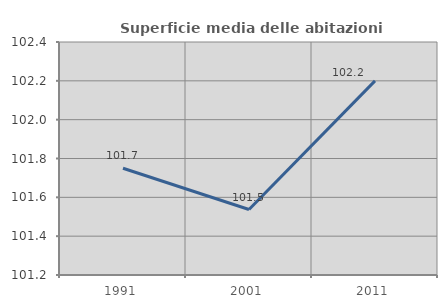
| Category | Superficie media delle abitazioni occupate |
|---|---|
| 1991.0 | 101.75 |
| 2001.0 | 101.537 |
| 2011.0 | 102.2 |